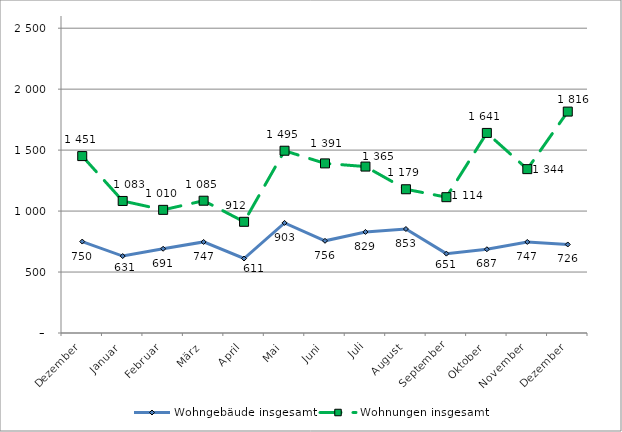
| Category | Wohngebäude insgesamt | Wohnungen insgesamt |
|---|---|---|
| Dezember | 750 | 1451 |
| Januar | 631 | 1083 |
| Februar | 691 | 1010 |
| März | 747 | 1085 |
| April | 611 | 912 |
| Mai | 903 | 1495 |
| Juni | 756 | 1391 |
| Juli | 829 | 1365 |
| August | 853 | 1179 |
| September | 651 | 1114 |
| Oktober | 687 | 1641 |
| November | 747 | 1344 |
| Dezember | 726 | 1816 |